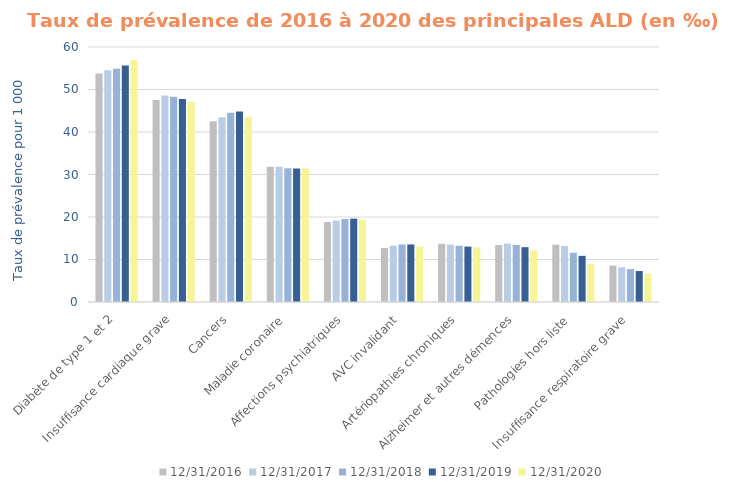
| Category | 31/12/2016 | 31/12/2017 | 31/12/2018 | 31/12/2019 | 31/12/2020 |
|---|---|---|---|---|---|
| Diabète de type 1 et 2 | 53.764 | 54.528 | 54.898 | 55.647 | 56.926 |
| Insuffisance cardiaque grave | 47.534 | 48.614 | 48.268 | 47.784 | 47.053 |
| Cancers | 42.501 | 43.449 | 44.536 | 44.808 | 43.6 |
| Maladie coronaire | 31.837 | 31.844 | 31.456 | 31.435 | 31.395 |
| Affections psychiatriques | 18.834 | 19.158 | 19.541 | 19.613 | 19.382 |
| AVC invalidant | 12.714 | 13.242 | 13.54 | 13.544 | 12.982 |
| Artériopathies chroniques | 13.694 | 13.518 | 13.239 | 13.042 | 12.865 |
| Alzheimer et autres démences | 13.397 | 13.762 | 13.424 | 12.906 | 12.147 |
| Pathologies hors liste | 13.487 | 13.161 | 11.584 | 10.86 | 8.896 |
| Insuffisance respiratoire grave | 8.568 | 8.143 | 7.745 | 7.284 | 6.645 |